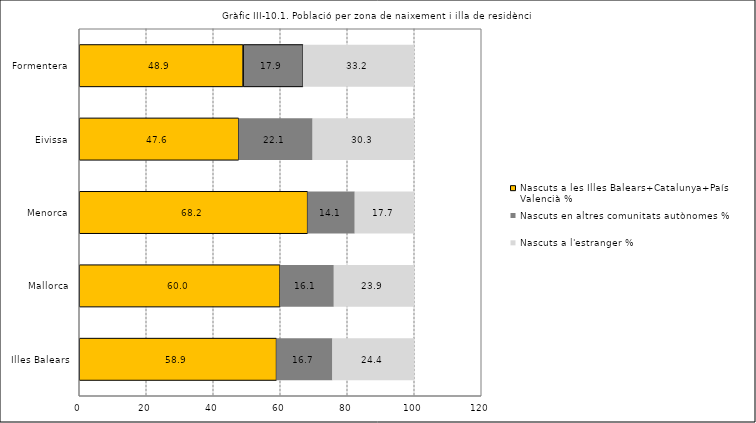
| Category | Nascuts a les Illes Balears+Catalunya+País Valencià % | Nascuts en altres comunitats autònomes % | Nascuts a l'estranger % |
|---|---|---|---|
| Illes Balears | 58.9 | 16.74 | 24.35 |
| Mallorca | 59.95 | 16.11 | 23.94 |
| Menorca | 68.19 | 14.12 | 17.69 |
| Eivissa | 47.62 | 22.11 | 30.27 |
| Formentera | 48.92 | 17.91 | 33.16 |